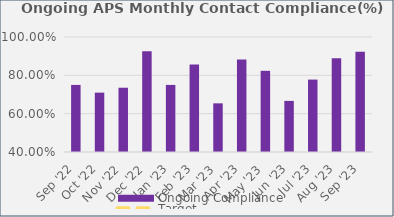
| Category | Ongoing Compliance |
|---|---|
| Sep '22 | 0.75 |
| Oct '22 | 0.71 |
| Nov '22 | 0.735 |
| Dec '22 | 0.926 |
| Jan '23 | 0.75 |
| Feb '23 | 0.857 |
| Mar '23 | 0.654 |
| Apr '23 | 0.882 |
| May '23 | 0.824 |
| Jun '23 | 0.667 |
| Jul '23 | 0.778 |
| Aug '23 | 0.889 |
| Sep '23 | 0.923 |